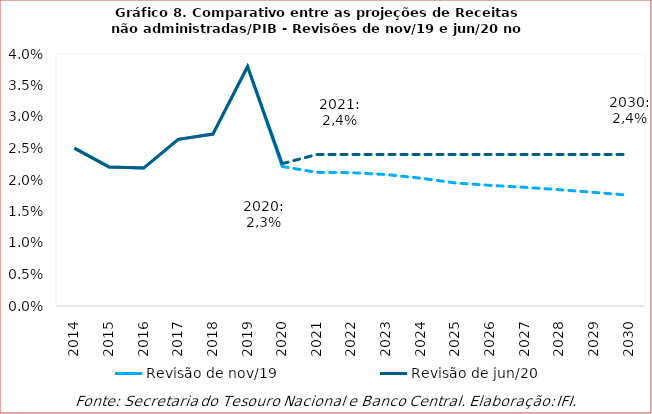
| Category | Revisão de nov/19 | Revisão de jun/20 |
|---|---|---|
| 2014.0 | 0.025 | 0.025 |
| 2015.0 | 0.022 | 0.022 |
| 2016.0 | 0.022 | 0.022 |
| 2017.0 | 0.026 | 0.026 |
| 2018.0 | 0.027 | 0.027 |
| 2019.0 | 0.038 | 0.038 |
| 2020.0 | 0.022 | 0.023 |
| 2021.0 | 0.021 | 0.024 |
| 2022.0 | 0.021 | 0.024 |
| 2023.0 | 0.021 | 0.024 |
| 2024.0 | 0.02 | 0.024 |
| 2025.0 | 0.02 | 0.024 |
| 2026.0 | 0.019 | 0.024 |
| 2027.0 | 0.019 | 0.024 |
| 2028.0 | 0.018 | 0.024 |
| 2029.0 | 0.018 | 0.024 |
| 2030.0 | 0.018 | 0.024 |